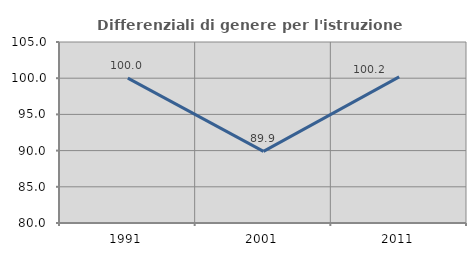
| Category | Differenziali di genere per l'istruzione superiore |
|---|---|
| 1991.0 | 100.01 |
| 2001.0 | 89.889 |
| 2011.0 | 100.185 |